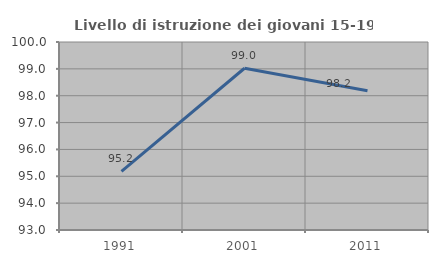
| Category | Livello di istruzione dei giovani 15-19 anni |
|---|---|
| 1991.0 | 95.181 |
| 2001.0 | 99.023 |
| 2011.0 | 98.187 |